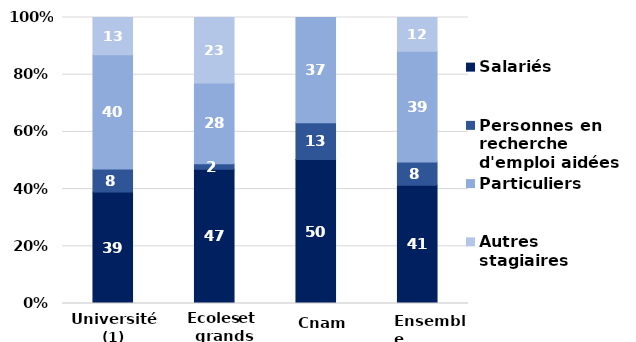
| Category | Salariés | Personnes en recherche d'emploi aidées | Particuliers | Autres stagiaires |
|---|---|---|---|---|
| 0 | 39 | 8 | 40 | 13 |
| 1 | 46.912 | 1.914 | 28.282 | 22.891 |
| 2 | 50.319 | 12.917 | 36.764 | 0 |
| 3 | 41.333 | 8.146 | 38.741 | 11.78 |